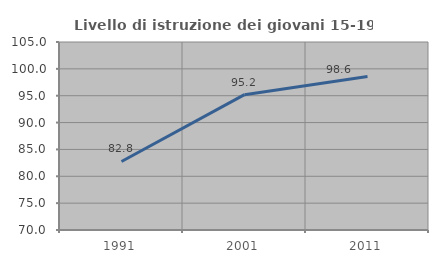
| Category | Livello di istruzione dei giovani 15-19 anni |
|---|---|
| 1991.0 | 82.759 |
| 2001.0 | 95.197 |
| 2011.0 | 98.571 |